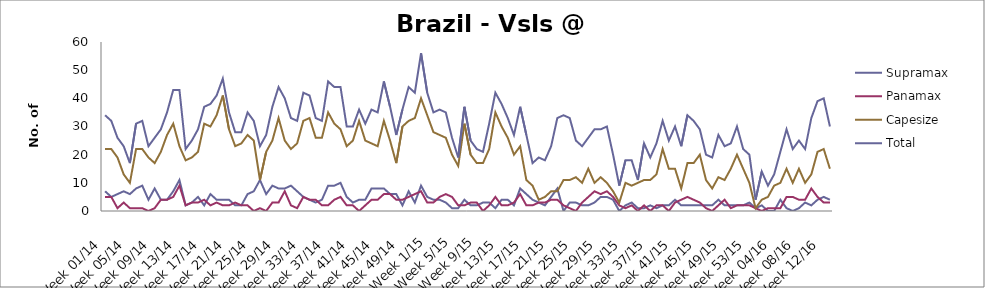
| Category | Supramax | Panamax | Capesize | Total |
|---|---|---|---|---|
| Week 01/14 | 7 | 5 | 22 | 34 |
| Week 02/14 | 5 | 5 | 22 | 32 |
| Week 03/14 | 6 | 1 | 19 | 26 |
| Week 04/14 | 7 | 3 | 13 | 23 |
| Week 05/14 | 6 | 1 | 10 | 17 |
| Week 06/14 | 8 | 1 | 22 | 31 |
| Week 07/14 | 9 | 1 | 22 | 32 |
| Week 08/14 | 4 | 0 | 19 | 23 |
| Week 09/14 | 8 | 1 | 17 | 26 |
| Week 10/14 | 4 | 4 | 21 | 29 |
| Week 11/14 | 4 | 4 | 27 | 35 |
| Week 12/14 | 7 | 5 | 31 | 43 |
| Week 13/14 | 11 | 9 | 23 | 43 |
| Week 14/14 | 2 | 2 | 18 | 22 |
| Week 15/14 | 3 | 3 | 19 | 25 |
| Week 16/14 | 5 | 3 | 21 | 29 |
| Week 17/14 | 2 | 4 | 31 | 37 |
| Week 18/14 | 6 | 2 | 30 | 38 |
| Week 19/14 | 4 | 3 | 34 | 41 |
| Week 20/14 | 4 | 2 | 41 | 47 |
| Week 21/14 | 4 | 2 | 29 | 35 |
| Week 22/14 | 2 | 3 | 23 | 28 |
| Week 23/14 | 2 | 2 | 24 | 28 |
| Week 24/14 | 6 | 2 | 27 | 35 |
| Week 25/14 | 7 | 0 | 25 | 32 |
| Week 26/14 | 11 | 1 | 11 | 23 |
| Week 27/14 | 6 | 0 | 21 | 27 |
| Week 28/14 | 9 | 3 | 25 | 37 |
| Week 29/14 | 8 | 3 | 33 | 44 |
| Week 30/14 | 8 | 7 | 25 | 40 |
| Week 31/14 | 9 | 2 | 22 | 33 |
| Week 32/14 | 7 | 1 | 24 | 32 |
| Week 33/14 | 5 | 5 | 32 | 42 |
| Week 34/14 | 4 | 4 | 33 | 41 |
| Week 35/14 | 3 | 4 | 26 | 33 |
| Week 36/14 | 4 | 2 | 26 | 32 |
| Week 37/14 | 9 | 2 | 35 | 46 |
| Week 38/14 | 9 | 4 | 31 | 44 |
| Week 39/14 | 10 | 5 | 29 | 44 |
| Week 40/14 | 5 | 2 | 23 | 30 |
| Week 41/14 | 3 | 2 | 25 | 30 |
| Week 42/14 | 4 | 0 | 32 | 36 |
| Week 43/14 | 4 | 2 | 25 | 31 |
| Week 44/14 | 8 | 4 | 24 | 36 |
| Week 45/14 | 8 | 4 | 23 | 35 |
| Week 46/14 | 8 | 6 | 32 | 46 |
| Week 47/14 | 6 | 6 | 25 | 37 |
| Week 48/14 | 6 | 4 | 17 | 27 |
| Week 49/14 | 2 | 4 | 30 | 36 |
| Week 50/14 | 7 | 5 | 32 | 44 |
| Week 51/14 | 3 | 6 | 33 | 42 |
| Week 52/14 | 9 | 7 | 40 | 56 |
| Week 1/15 | 5 | 3 | 34 | 42 |
| Week 2/15 | 4 | 3 | 28 | 35 |
| Week 3/15 | 4 | 5 | 27 | 36 |
| Week 4/15 | 3 | 6 | 26 | 35 |
| Week 5/15 | 1 | 5 | 20 | 26 |
| Week 6/15 | 1 | 2 | 16 | 19 |
| Week 7/15 | 4 | 2 | 31 | 37 |
| Week 8/15 | 2 | 3 | 20 | 25 |
| Week 9/15 | 2 | 3 | 17 | 22 |
| Week 10/15 | 3 | 0 | 17 | 21 |
| Week 11/15 | 3 | 2 | 22 | 31 |
| Week 12/15 | 1 | 5 | 35 | 42 |
| Week 13/15 | 4 | 2 | 30 | 38 |
| Week 14/15 | 4 | 2 | 26 | 33 |
| Week 15/15 | 2 | 3 | 20 | 27 |
| Week 16/15 | 8 | 6 | 23 | 37 |
| Week 17/15 | 6 | 2 | 11 | 27 |
| Week 18/15 | 4 | 2 | 9 | 17 |
| Week 19/15 | 3 | 3 | 4 | 19 |
| Week 20/15 | 2 | 3 | 5 | 18 |
| Week 21/15 | 5 | 4 | 7 | 23 |
| Week 22/15 | 8 | 4 | 7 | 33 |
| Week 23/15 | 0 | 2 | 11 | 34 |
| Week 24/15 | 3 | 1 | 11 | 33 |
| Week 25/15 | 3 | 0 | 12 | 25 |
| Week 26/15 | 2 | 3 | 10 | 23 |
| Week 27/15 | 2 | 5 | 15 | 26 |
| Week 28/15 | 3 | 7 | 10 | 29 |
| Week 29/15 | 5 | 6 | 12 | 29 |
| Week 30/15 | 5 | 7 | 10 | 30 |
| Week 31/15 | 4 | 5 | 7 | 20 |
| Week 32/15 | 0 | 2 | 3 | 9 |
| Week 33/15 | 2 | 1 | 10 | 18 |
| Week 34/15 | 3 | 2 | 9 | 18 |
| Week 35/15 | 1 | 0 | 10 | 11 |
| Week 36/15 | 1 | 2 | 11 | 24 |
| Week 37/15 | 2 | 0 | 11 | 19 |
| Week 38/15 | 1 | 2 | 13 | 24 |
| Week 39/15 | 2 | 2 | 22 | 32 |
| Week 40/15 | 2 | 0 | 15 | 25 |
| Week 41/15 | 4 | 3 | 15 | 30 |
| Week 42/15 | 2 | 4 | 8 | 23 |
| Week 43/15 | 2 | 5 | 17 | 34 |
| Week 44/15 | 2 | 4 | 17 | 32 |
| Week 45/15 | 2 | 3 | 20 | 29 |
| Week 46/15 | 2 | 1 | 11 | 20 |
| Week 47/15 | 2 | 0 | 8 | 19 |
| Week 48/15 | 4 | 2 | 12 | 27 |
| Week 49/15 | 2 | 4 | 11 | 23 |
| Week 50/15 | 2 | 1 | 15 | 24 |
| Week 51/15 | 2 | 2 | 20 | 30 |
| Week 52/15 | 2 | 2 | 15 | 22 |
| Week 53/15 | 3 | 2 | 10 | 20 |
| Week 01/16 | 1 | 1 | 1 | 4 |
| Week 02/16 | 2 | 0 | 4 | 14 |
| Week 03/16 | 0 | 1 | 5 | 9 |
| Week 04/16 | 0 | 1 | 9 | 13 |
| Week 05/16 | 4 | 1 | 10 | 21 |
| Week 06/16 | 1 | 5 | 15 | 29 |
| Week 07/16 | 0 | 5 | 10 | 22 |
| Week 08/16 | 1 | 4 | 15 | 25 |
| Week 09/16 | 3 | 4 | 10 | 22 |
| Week 10/16 | 2 | 8 | 13 | 33 |
| Week 11/16 | 4 | 5 | 21 | 39 |
| Week 12/16 | 5 | 3 | 22 | 40 |
| Week 13/16 | 4 | 3 | 15 | 30 |